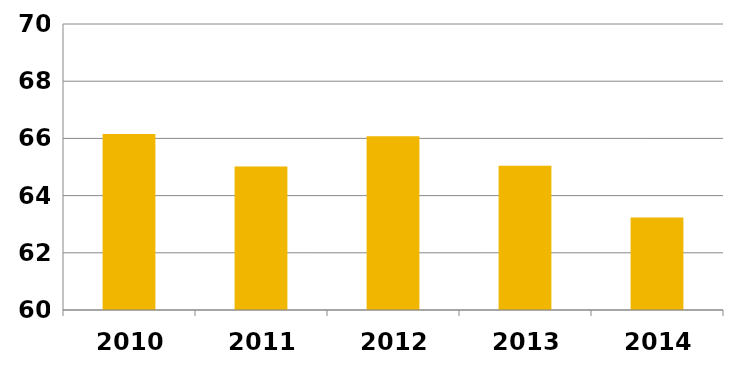
| Category | Series 0 |
|---|---|
| 2010.0 | 66.157 |
| 2011.0 | 65.017 |
| 2012.0 | 66.078 |
| 2013.0 | 65.043 |
| 2014.0 | 63.234 |